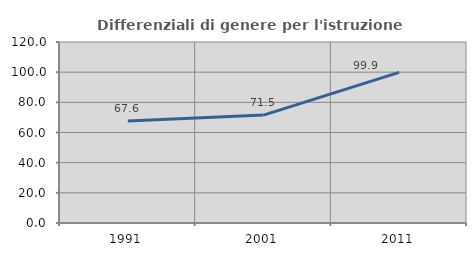
| Category | Differenziali di genere per l'istruzione superiore |
|---|---|
| 1991.0 | 67.562 |
| 2001.0 | 71.538 |
| 2011.0 | 99.865 |